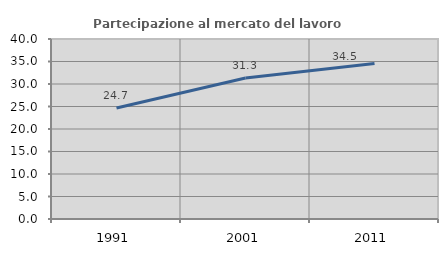
| Category | Partecipazione al mercato del lavoro  femminile |
|---|---|
| 1991.0 | 24.684 |
| 2001.0 | 31.323 |
| 2011.0 | 34.542 |